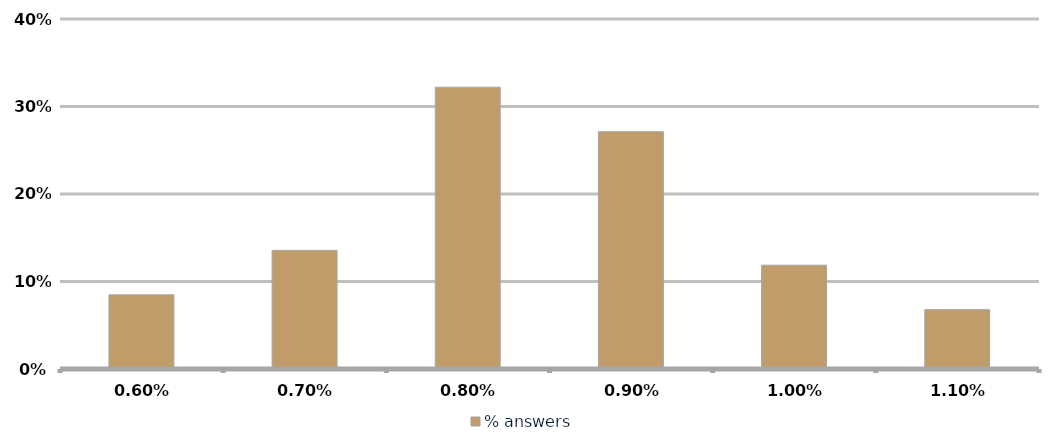
| Category | % answers |
|---|---|
| 0.006 | 0.085 |
| 0.007 | 0.136 |
| 0.008 | 0.322 |
| 0.009000000000000001 | 0.271 |
| 0.010000000000000002 | 0.119 |
| 0.011000000000000003 | 0.068 |